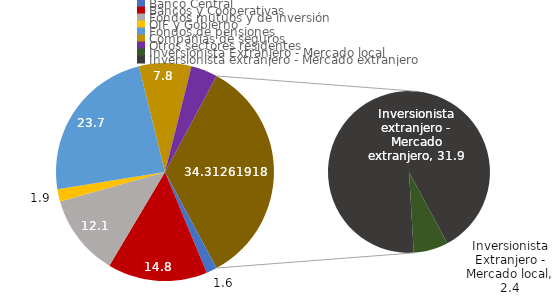
| Category | Series 0 |
|---|---|
| Banco Central | 1.587 |
| Bancos y Cooperativas | 14.793 |
| Fondos mutuos y de inversión | 12.087 |
| OIF y Gobierno | 1.853 |
| Fondos de pensiones | 23.684 |
| Compañias de seguros | 7.753 |
| Otros sectores residentes | 3.931 |
| Inversionista Extranjero - Mercado local | 2.367 |
| Inversionista extranjero - Mercado extranjero | 31.946 |